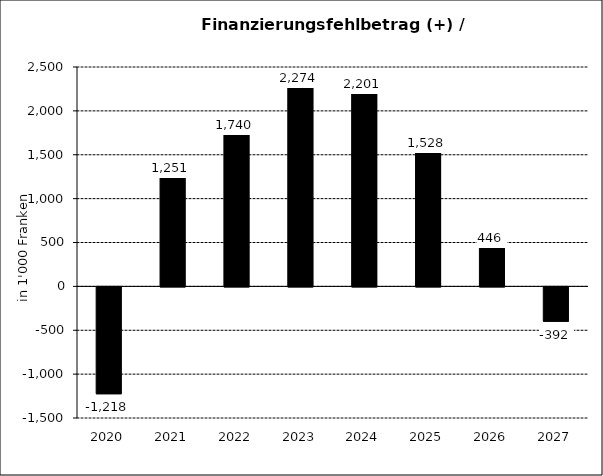
| Category | Finanzierungsfehlbetrag (+) / -überschuss (-) |
|---|---|
| 2020.0 | -1218 |
| 2021.0 | 1251 |
| 2022.0 | 1740 |
| 2023.0 | 2273.638 |
| 2024.0 | 2201.373 |
| 2025.0 | 1528.116 |
| 2026.0 | 445.82 |
| 2027.0 | -392.271 |